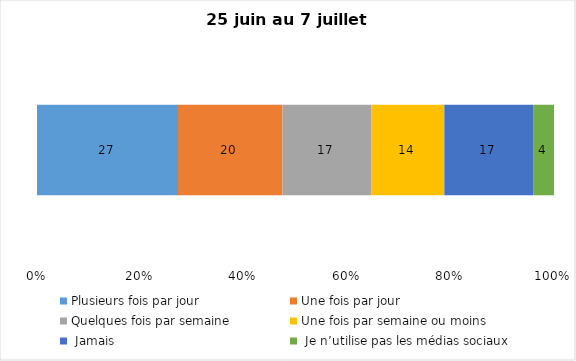
| Category | Plusieurs fois par jour | Une fois par jour | Quelques fois par semaine   | Une fois par semaine ou moins   |  Jamais   |  Je n’utilise pas les médias sociaux |
|---|---|---|---|---|---|---|
| 0 | 27 | 20 | 17 | 14 | 17 | 4 |